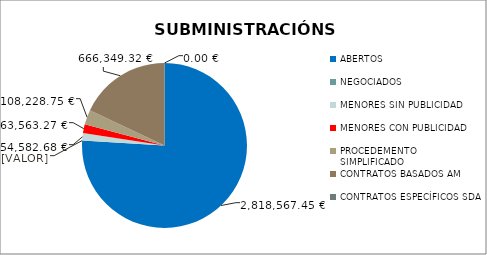
| Category | Series 0 |
|---|---|
| ABERTOS  | 2818567.45 |
| NEGOCIADOS  | 0 |
| MENORES SIN PUBLICIDAD | 54582.68 |
| MENORES CON PUBLICIDAD | 63563.27 |
| PROCEDEMENTO SIMPLIFICADO | 108228.75 |
| CONTRATOS BASADOS AM | 666349.32 |
| CONTRATOS ESPECÍFICOS SDA | 0 |